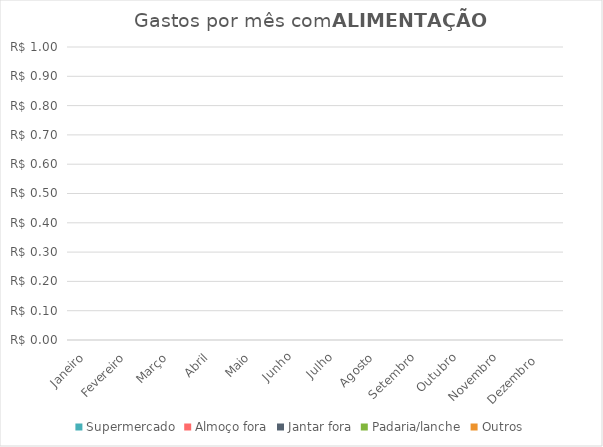
| Category | Supermercado | Almoço fora | Jantar fora | Padaria/lanche | Outros |
|---|---|---|---|---|---|
| Janeiro | 0 | 0 | 0 | 0 | 0 |
| Fevereiro | 0 | 0 | 0 | 0 | 0 |
| Março | 0 | 0 | 0 | 0 | 0 |
| Abril | 0 | 0 | 0 | 0 | 0 |
| Maio | 0 | 0 | 0 | 0 | 0 |
| Junho | 0 | 0 | 0 | 0 | 0 |
| Julho | 0 | 0 | 0 | 0 | 0 |
| Agosto | 0 | 0 | 0 | 0 | 0 |
| Setembro | 0 | 0 | 0 | 0 | 0 |
| Outubro | 0 | 0 | 0 | 0 | 0 |
| Novembro | 0 | 0 | 0 | 0 | 0 |
| Dezembro  | 0 | 0 | 0 | 0 | 0 |